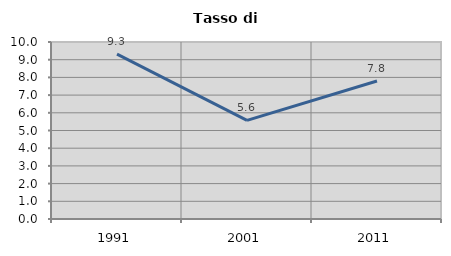
| Category | Tasso di disoccupazione   |
|---|---|
| 1991.0 | 9.314 |
| 2001.0 | 5.573 |
| 2011.0 | 7.797 |